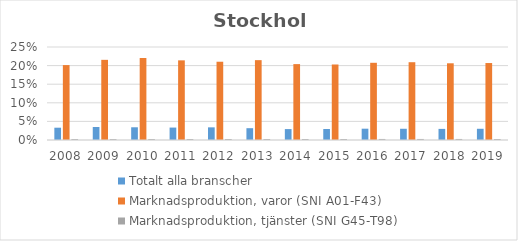
| Category | Totalt alla branscher | Marknadsproduktion, varor (SNI A01-F43) | Marknadsproduktion, tjänster (SNI G45-T98) |
|---|---|---|---|
| 2008 | 0.033 | 0.201 | 0.003 |
| 2009 | 0.035 | 0.215 | 0.003 |
| 2010 | 0.034 | 0.22 | 0.003 |
| 2011 | 0.033 | 0.214 | 0.003 |
| 2012 | 0.034 | 0.21 | 0.003 |
| 2013 | 0.032 | 0.215 | 0.003 |
| 2014 | 0.029 | 0.204 | 0.003 |
| 2015 | 0.03 | 0.203 | 0.003 |
| 2016 | 0.03 | 0.208 | 0.003 |
| 2017 | 0.03 | 0.209 | 0.003 |
| 2018 | 0.03 | 0.206 | 0.003 |
| 2019 | 0.03 | 0.207 | 0.003 |